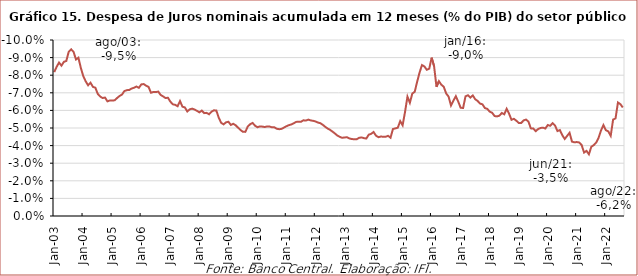
| Category | Juros nominais |
|---|---|
| 2003-01-01 | -0.082 |
| 2003-02-01 | -0.085 |
| 2003-03-01 | -0.087 |
| 2003-04-01 | -0.085 |
| 2003-05-01 | -0.088 |
| 2003-06-01 | -0.088 |
| 2003-07-01 | -0.093 |
| 2003-08-01 | -0.095 |
| 2003-09-01 | -0.093 |
| 2003-10-01 | -0.089 |
| 2003-11-01 | -0.09 |
| 2003-12-01 | -0.084 |
| 2004-01-01 | -0.08 |
| 2004-02-01 | -0.077 |
| 2004-03-01 | -0.074 |
| 2004-04-01 | -0.076 |
| 2004-05-01 | -0.073 |
| 2004-06-01 | -0.073 |
| 2004-07-01 | -0.069 |
| 2004-08-01 | -0.068 |
| 2004-09-01 | -0.067 |
| 2004-10-01 | -0.067 |
| 2004-11-01 | -0.065 |
| 2004-12-01 | -0.066 |
| 2005-01-01 | -0.066 |
| 2005-02-01 | -0.066 |
| 2005-03-01 | -0.067 |
| 2005-04-01 | -0.068 |
| 2005-05-01 | -0.069 |
| 2005-06-01 | -0.071 |
| 2005-07-01 | -0.071 |
| 2005-08-01 | -0.072 |
| 2005-09-01 | -0.072 |
| 2005-10-01 | -0.073 |
| 2005-11-01 | -0.074 |
| 2005-12-01 | -0.073 |
| 2006-01-01 | -0.075 |
| 2006-02-01 | -0.075 |
| 2006-03-01 | -0.074 |
| 2006-04-01 | -0.073 |
| 2006-05-01 | -0.07 |
| 2006-06-01 | -0.07 |
| 2006-07-01 | -0.07 |
| 2006-08-01 | -0.071 |
| 2006-09-01 | -0.069 |
| 2006-10-01 | -0.068 |
| 2006-11-01 | -0.067 |
| 2006-12-01 | -0.067 |
| 2007-01-01 | -0.065 |
| 2007-02-01 | -0.063 |
| 2007-03-01 | -0.063 |
| 2007-04-01 | -0.062 |
| 2007-05-01 | -0.065 |
| 2007-06-01 | -0.062 |
| 2007-07-01 | -0.062 |
| 2007-08-01 | -0.059 |
| 2007-09-01 | -0.061 |
| 2007-10-01 | -0.061 |
| 2007-11-01 | -0.06 |
| 2007-12-01 | -0.06 |
| 2008-01-01 | -0.059 |
| 2008-02-01 | -0.06 |
| 2008-03-01 | -0.058 |
| 2008-04-01 | -0.059 |
| 2008-05-01 | -0.058 |
| 2008-06-01 | -0.059 |
| 2008-07-01 | -0.06 |
| 2008-08-01 | -0.06 |
| 2008-09-01 | -0.056 |
| 2008-10-01 | -0.053 |
| 2008-11-01 | -0.052 |
| 2008-12-01 | -0.053 |
| 2009-01-01 | -0.054 |
| 2009-02-01 | -0.052 |
| 2009-03-01 | -0.052 |
| 2009-04-01 | -0.052 |
| 2009-05-01 | -0.05 |
| 2009-06-01 | -0.049 |
| 2009-07-01 | -0.048 |
| 2009-08-01 | -0.048 |
| 2009-09-01 | -0.051 |
| 2009-10-01 | -0.052 |
| 2009-11-01 | -0.053 |
| 2009-12-01 | -0.051 |
| 2010-01-01 | -0.05 |
| 2010-02-01 | -0.051 |
| 2010-03-01 | -0.051 |
| 2010-04-01 | -0.051 |
| 2010-05-01 | -0.051 |
| 2010-06-01 | -0.051 |
| 2010-07-01 | -0.05 |
| 2010-08-01 | -0.05 |
| 2010-09-01 | -0.05 |
| 2010-10-01 | -0.049 |
| 2010-11-01 | -0.05 |
| 2010-12-01 | -0.05 |
| 2011-01-01 | -0.051 |
| 2011-02-01 | -0.052 |
| 2011-03-01 | -0.052 |
| 2011-04-01 | -0.053 |
| 2011-05-01 | -0.053 |
| 2011-06-01 | -0.054 |
| 2011-07-01 | -0.054 |
| 2011-08-01 | -0.054 |
| 2011-09-01 | -0.054 |
| 2011-10-01 | -0.055 |
| 2011-11-01 | -0.054 |
| 2011-12-01 | -0.054 |
| 2012-01-01 | -0.054 |
| 2012-02-01 | -0.053 |
| 2012-03-01 | -0.053 |
| 2012-04-01 | -0.052 |
| 2012-05-01 | -0.051 |
| 2012-06-01 | -0.05 |
| 2012-07-01 | -0.049 |
| 2012-08-01 | -0.048 |
| 2012-09-01 | -0.047 |
| 2012-10-01 | -0.046 |
| 2012-11-01 | -0.045 |
| 2012-12-01 | -0.044 |
| 2013-01-01 | -0.045 |
| 2013-02-01 | -0.045 |
| 2013-03-01 | -0.044 |
| 2013-04-01 | -0.044 |
| 2013-05-01 | -0.044 |
| 2013-06-01 | -0.044 |
| 2013-07-01 | -0.044 |
| 2013-08-01 | -0.045 |
| 2013-09-01 | -0.044 |
| 2013-10-01 | -0.044 |
| 2013-11-01 | -0.046 |
| 2013-12-01 | -0.047 |
| 2014-01-01 | -0.048 |
| 2014-02-01 | -0.046 |
| 2014-03-01 | -0.045 |
| 2014-04-01 | -0.045 |
| 2014-05-01 | -0.045 |
| 2014-06-01 | -0.045 |
| 2014-07-01 | -0.046 |
| 2014-08-01 | -0.044 |
| 2014-09-01 | -0.049 |
| 2014-10-01 | -0.05 |
| 2014-11-01 | -0.05 |
| 2014-12-01 | -0.054 |
| 2015-01-01 | -0.052 |
| 2015-02-01 | -0.059 |
| 2015-03-01 | -0.068 |
| 2015-04-01 | -0.064 |
| 2015-05-01 | -0.07 |
| 2015-06-01 | -0.071 |
| 2015-07-01 | -0.076 |
| 2015-08-01 | -0.081 |
| 2015-09-01 | -0.086 |
| 2015-10-01 | -0.085 |
| 2015-11-01 | -0.083 |
| 2015-12-01 | -0.084 |
| 2016-01-01 | -0.09 |
| 2016-02-01 | -0.085 |
| 2016-03-01 | -0.073 |
| 2016-04-01 | -0.077 |
| 2016-05-01 | -0.075 |
| 2016-06-01 | -0.073 |
| 2016-07-01 | -0.07 |
| 2016-08-01 | -0.068 |
| 2016-09-01 | -0.063 |
| 2016-10-01 | -0.066 |
| 2016-11-01 | -0.068 |
| 2016-12-01 | -0.065 |
| 2017-01-01 | -0.061 |
| 2017-02-01 | -0.061 |
| 2017-03-01 | -0.068 |
| 2017-04-01 | -0.069 |
| 2017-05-01 | -0.067 |
| 2017-06-01 | -0.069 |
| 2017-07-01 | -0.066 |
| 2017-08-01 | -0.065 |
| 2017-09-01 | -0.064 |
| 2017-10-01 | -0.063 |
| 2017-11-01 | -0.061 |
| 2017-12-01 | -0.061 |
| 2018-01-01 | -0.059 |
| 2018-02-01 | -0.059 |
| 2018-03-01 | -0.057 |
| 2018-04-01 | -0.057 |
| 2018-05-01 | -0.057 |
| 2018-06-01 | -0.059 |
| 2018-07-01 | -0.058 |
| 2018-08-01 | -0.061 |
| 2018-09-01 | -0.058 |
| 2018-10-01 | -0.055 |
| 2018-11-01 | -0.055 |
| 2018-12-01 | -0.054 |
| 2019-01-01 | -0.053 |
| 2019-02-01 | -0.053 |
| 2019-03-01 | -0.054 |
| 2019-04-01 | -0.055 |
| 2019-05-01 | -0.054 |
| 2019-06-01 | -0.05 |
| 2019-07-01 | -0.05 |
| 2019-08-01 | -0.048 |
| 2019-09-01 | -0.049 |
| 2019-10-01 | -0.05 |
| 2019-11-01 | -0.05 |
| 2019-12-01 | -0.05 |
| 2020-01-01 | -0.052 |
| 2020-02-01 | -0.051 |
| 2020-03-01 | -0.053 |
| 2020-04-01 | -0.051 |
| 2020-05-01 | -0.048 |
| 2020-06-01 | -0.049 |
| 2020-07-01 | -0.046 |
| 2020-08-01 | -0.044 |
| 2020-09-01 | -0.046 |
| 2020-10-01 | -0.047 |
| 2020-11-01 | -0.042 |
| 2020-12-01 | -0.042 |
| 2021-01-01 | -0.042 |
| 2021-02-01 | -0.042 |
| 2021-03-01 | -0.04 |
| 2021-04-01 | -0.036 |
| 2021-05-01 | -0.037 |
| 2021-06-01 | -0.035 |
| 2021-07-01 | -0.039 |
| 2021-08-01 | -0.04 |
| 2021-09-01 | -0.042 |
| 2021-10-01 | -0.044 |
| 2021-11-01 | -0.049 |
| 2021-12-01 | -0.052 |
| 2022-01-01 | -0.049 |
| 2022-02-01 | -0.048 |
| 2022-03-01 | -0.046 |
| 2022-04-01 | -0.055 |
| 2022-05-01 | -0.055 |
| 2022-06-01 | -0.064 |
| 2022-07-01 | -0.064 |
| 2022-08-01 | -0.062 |